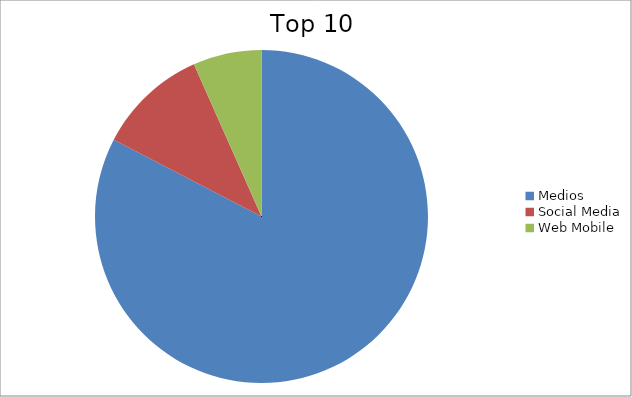
| Category | Series 0 |
|---|---|
| Medios | 82.62 |
| Social Media | 10.73 |
| Web Mobile | 6.65 |